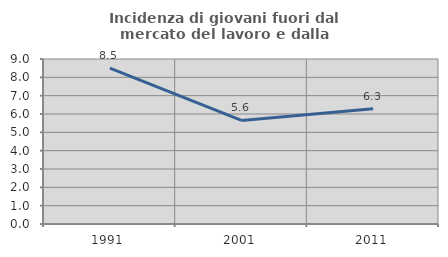
| Category | Incidenza di giovani fuori dal mercato del lavoro e dalla formazione  |
|---|---|
| 1991.0 | 8.504 |
| 2001.0 | 5.649 |
| 2011.0 | 6.284 |